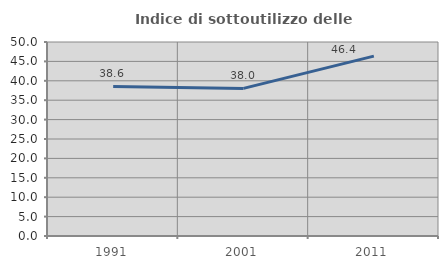
| Category | Indice di sottoutilizzo delle abitazioni  |
|---|---|
| 1991.0 | 38.554 |
| 2001.0 | 38.043 |
| 2011.0 | 46.358 |